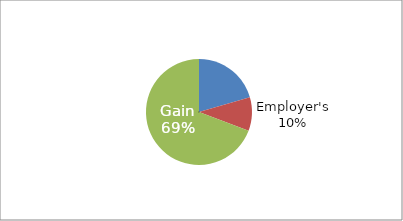
| Category | Series 0 |
|---|---|
| Your | 362772.491 |
| Employer's | 181386.245 |
| Gain | 1224953.045 |